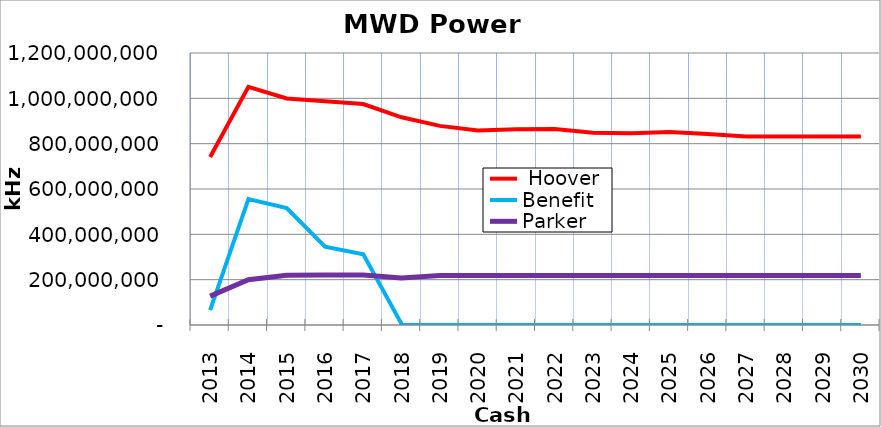
| Category |  Hoover | Benefit | Parker  |
|---|---|---|---|
| 2013.0 | 740900000 | 65660944.288 | 127500000 |
| 2014.0 | 1050470000 | 555232459.135 | 199350000 |
| 2015.0 | 999116679.5 | 515419330.318 | 219250000 |
| 2016.0 | 987443864.71 | 345529287.039 | 220300000 |
| 2017.0 | 974679000 | 312292368.818 | 220300000 |
| 2018.0 | 916305713.351 | 4953986.029 | 207900000 |
| 2019.0 | 878481701.358 | 0 | 218900000 |
| 2020.0 | 857798152.859 | 0 | 218900000 |
| 2021.0 | 863982360.277 | 0 | 218900000 |
| 2022.0 | 865135267.136 | 0 | 218900000 |
| 2023.0 | 848239200.804 | 0 | 218900000 |
| 2024.0 | 845689381.236 | 0 | 218900000 |
| 2025.0 | 851124583.287 | 0 | 218900000 |
| 2026.0 | 843109660.636 | 0 | 218900000 |
| 2027.0 | 831345788.9 | 0 | 218900000 |
| 2028.0 | 831345788.9 | 0 | 218900000 |
| 2029.0 | 831345788.9 | 0 | 218900000 |
| 2030.0 | 831345788.9 | 0 | 218900000 |